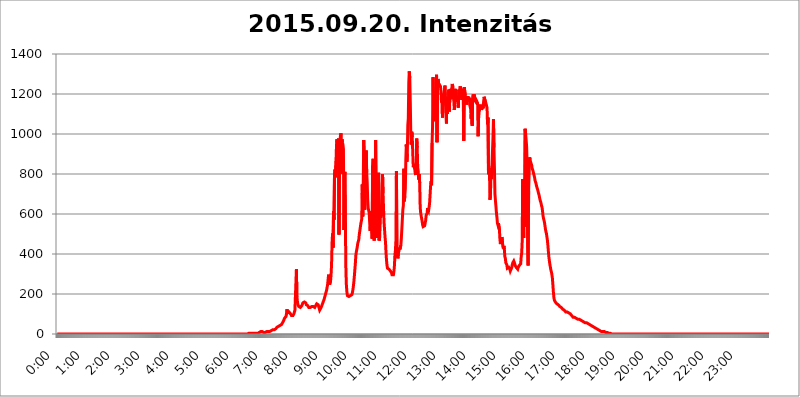
| Category | 2015.09.20. Intenzitás [W/m^2] |
|---|---|
| 0.0 | 0 |
| 0.0006944444444444445 | 0 |
| 0.001388888888888889 | 0 |
| 0.0020833333333333333 | 0 |
| 0.002777777777777778 | 0 |
| 0.003472222222222222 | 0 |
| 0.004166666666666667 | 0 |
| 0.004861111111111111 | 0 |
| 0.005555555555555556 | 0 |
| 0.0062499999999999995 | 0 |
| 0.006944444444444444 | 0 |
| 0.007638888888888889 | 0 |
| 0.008333333333333333 | 0 |
| 0.009027777777777779 | 0 |
| 0.009722222222222222 | 0 |
| 0.010416666666666666 | 0 |
| 0.011111111111111112 | 0 |
| 0.011805555555555555 | 0 |
| 0.012499999999999999 | 0 |
| 0.013194444444444444 | 0 |
| 0.013888888888888888 | 0 |
| 0.014583333333333332 | 0 |
| 0.015277777777777777 | 0 |
| 0.015972222222222224 | 0 |
| 0.016666666666666666 | 0 |
| 0.017361111111111112 | 0 |
| 0.018055555555555557 | 0 |
| 0.01875 | 0 |
| 0.019444444444444445 | 0 |
| 0.02013888888888889 | 0 |
| 0.020833333333333332 | 0 |
| 0.02152777777777778 | 0 |
| 0.022222222222222223 | 0 |
| 0.02291666666666667 | 0 |
| 0.02361111111111111 | 0 |
| 0.024305555555555556 | 0 |
| 0.024999999999999998 | 0 |
| 0.025694444444444447 | 0 |
| 0.02638888888888889 | 0 |
| 0.027083333333333334 | 0 |
| 0.027777777777777776 | 0 |
| 0.02847222222222222 | 0 |
| 0.029166666666666664 | 0 |
| 0.029861111111111113 | 0 |
| 0.030555555555555555 | 0 |
| 0.03125 | 0 |
| 0.03194444444444445 | 0 |
| 0.03263888888888889 | 0 |
| 0.03333333333333333 | 0 |
| 0.034027777777777775 | 0 |
| 0.034722222222222224 | 0 |
| 0.035416666666666666 | 0 |
| 0.036111111111111115 | 0 |
| 0.03680555555555556 | 0 |
| 0.0375 | 0 |
| 0.03819444444444444 | 0 |
| 0.03888888888888889 | 0 |
| 0.03958333333333333 | 0 |
| 0.04027777777777778 | 0 |
| 0.04097222222222222 | 0 |
| 0.041666666666666664 | 0 |
| 0.042361111111111106 | 0 |
| 0.04305555555555556 | 0 |
| 0.043750000000000004 | 0 |
| 0.044444444444444446 | 0 |
| 0.04513888888888889 | 0 |
| 0.04583333333333334 | 0 |
| 0.04652777777777778 | 0 |
| 0.04722222222222222 | 0 |
| 0.04791666666666666 | 0 |
| 0.04861111111111111 | 0 |
| 0.049305555555555554 | 0 |
| 0.049999999999999996 | 0 |
| 0.05069444444444445 | 0 |
| 0.051388888888888894 | 0 |
| 0.052083333333333336 | 0 |
| 0.05277777777777778 | 0 |
| 0.05347222222222222 | 0 |
| 0.05416666666666667 | 0 |
| 0.05486111111111111 | 0 |
| 0.05555555555555555 | 0 |
| 0.05625 | 0 |
| 0.05694444444444444 | 0 |
| 0.057638888888888885 | 0 |
| 0.05833333333333333 | 0 |
| 0.05902777777777778 | 0 |
| 0.059722222222222225 | 0 |
| 0.06041666666666667 | 0 |
| 0.061111111111111116 | 0 |
| 0.06180555555555556 | 0 |
| 0.0625 | 0 |
| 0.06319444444444444 | 0 |
| 0.06388888888888888 | 0 |
| 0.06458333333333334 | 0 |
| 0.06527777777777778 | 0 |
| 0.06597222222222222 | 0 |
| 0.06666666666666667 | 0 |
| 0.06736111111111111 | 0 |
| 0.06805555555555555 | 0 |
| 0.06874999999999999 | 0 |
| 0.06944444444444443 | 0 |
| 0.07013888888888889 | 0 |
| 0.07083333333333333 | 0 |
| 0.07152777777777779 | 0 |
| 0.07222222222222223 | 0 |
| 0.07291666666666667 | 0 |
| 0.07361111111111111 | 0 |
| 0.07430555555555556 | 0 |
| 0.075 | 0 |
| 0.07569444444444444 | 0 |
| 0.0763888888888889 | 0 |
| 0.07708333333333334 | 0 |
| 0.07777777777777778 | 0 |
| 0.07847222222222222 | 0 |
| 0.07916666666666666 | 0 |
| 0.0798611111111111 | 0 |
| 0.08055555555555556 | 0 |
| 0.08125 | 0 |
| 0.08194444444444444 | 0 |
| 0.08263888888888889 | 0 |
| 0.08333333333333333 | 0 |
| 0.08402777777777777 | 0 |
| 0.08472222222222221 | 0 |
| 0.08541666666666665 | 0 |
| 0.08611111111111112 | 0 |
| 0.08680555555555557 | 0 |
| 0.08750000000000001 | 0 |
| 0.08819444444444445 | 0 |
| 0.08888888888888889 | 0 |
| 0.08958333333333333 | 0 |
| 0.09027777777777778 | 0 |
| 0.09097222222222222 | 0 |
| 0.09166666666666667 | 0 |
| 0.09236111111111112 | 0 |
| 0.09305555555555556 | 0 |
| 0.09375 | 0 |
| 0.09444444444444444 | 0 |
| 0.09513888888888888 | 0 |
| 0.09583333333333333 | 0 |
| 0.09652777777777777 | 0 |
| 0.09722222222222222 | 0 |
| 0.09791666666666667 | 0 |
| 0.09861111111111111 | 0 |
| 0.09930555555555555 | 0 |
| 0.09999999999999999 | 0 |
| 0.10069444444444443 | 0 |
| 0.1013888888888889 | 0 |
| 0.10208333333333335 | 0 |
| 0.10277777777777779 | 0 |
| 0.10347222222222223 | 0 |
| 0.10416666666666667 | 0 |
| 0.10486111111111111 | 0 |
| 0.10555555555555556 | 0 |
| 0.10625 | 0 |
| 0.10694444444444444 | 0 |
| 0.1076388888888889 | 0 |
| 0.10833333333333334 | 0 |
| 0.10902777777777778 | 0 |
| 0.10972222222222222 | 0 |
| 0.1111111111111111 | 0 |
| 0.11180555555555556 | 0 |
| 0.11180555555555556 | 0 |
| 0.1125 | 0 |
| 0.11319444444444444 | 0 |
| 0.11388888888888889 | 0 |
| 0.11458333333333333 | 0 |
| 0.11527777777777777 | 0 |
| 0.11597222222222221 | 0 |
| 0.11666666666666665 | 0 |
| 0.1173611111111111 | 0 |
| 0.11805555555555557 | 0 |
| 0.11944444444444445 | 0 |
| 0.12013888888888889 | 0 |
| 0.12083333333333333 | 0 |
| 0.12152777777777778 | 0 |
| 0.12222222222222223 | 0 |
| 0.12291666666666667 | 0 |
| 0.12291666666666667 | 0 |
| 0.12361111111111112 | 0 |
| 0.12430555555555556 | 0 |
| 0.125 | 0 |
| 0.12569444444444444 | 0 |
| 0.12638888888888888 | 0 |
| 0.12708333333333333 | 0 |
| 0.16875 | 0 |
| 0.12847222222222224 | 0 |
| 0.12916666666666668 | 0 |
| 0.12986111111111112 | 0 |
| 0.13055555555555556 | 0 |
| 0.13125 | 0 |
| 0.13194444444444445 | 0 |
| 0.1326388888888889 | 0 |
| 0.13333333333333333 | 0 |
| 0.13402777777777777 | 0 |
| 0.13402777777777777 | 0 |
| 0.13472222222222222 | 0 |
| 0.13541666666666666 | 0 |
| 0.1361111111111111 | 0 |
| 0.13749999999999998 | 0 |
| 0.13819444444444443 | 0 |
| 0.1388888888888889 | 0 |
| 0.13958333333333334 | 0 |
| 0.14027777777777778 | 0 |
| 0.14097222222222222 | 0 |
| 0.14166666666666666 | 0 |
| 0.1423611111111111 | 0 |
| 0.14305555555555557 | 0 |
| 0.14375000000000002 | 0 |
| 0.14444444444444446 | 0 |
| 0.1451388888888889 | 0 |
| 0.1451388888888889 | 0 |
| 0.14652777777777778 | 0 |
| 0.14722222222222223 | 0 |
| 0.14791666666666667 | 0 |
| 0.1486111111111111 | 0 |
| 0.14930555555555555 | 0 |
| 0.15 | 0 |
| 0.15069444444444444 | 0 |
| 0.15138888888888888 | 0 |
| 0.15208333333333332 | 0 |
| 0.15277777777777776 | 0 |
| 0.15347222222222223 | 0 |
| 0.15416666666666667 | 0 |
| 0.15486111111111112 | 0 |
| 0.15555555555555556 | 0 |
| 0.15625 | 0 |
| 0.15694444444444444 | 0 |
| 0.15763888888888888 | 0 |
| 0.15833333333333333 | 0 |
| 0.15902777777777777 | 0 |
| 0.15972222222222224 | 0 |
| 0.16041666666666668 | 0 |
| 0.16111111111111112 | 0 |
| 0.16180555555555556 | 0 |
| 0.1625 | 0 |
| 0.16319444444444445 | 0 |
| 0.1638888888888889 | 0 |
| 0.16458333333333333 | 0 |
| 0.16527777777777777 | 0 |
| 0.16597222222222222 | 0 |
| 0.16666666666666666 | 0 |
| 0.1673611111111111 | 0 |
| 0.16805555555555554 | 0 |
| 0.16874999999999998 | 0 |
| 0.16944444444444443 | 0 |
| 0.17013888888888887 | 0 |
| 0.1708333333333333 | 0 |
| 0.17152777777777775 | 0 |
| 0.17222222222222225 | 0 |
| 0.1729166666666667 | 0 |
| 0.17361111111111113 | 0 |
| 0.17430555555555557 | 0 |
| 0.17500000000000002 | 0 |
| 0.17569444444444446 | 0 |
| 0.1763888888888889 | 0 |
| 0.17708333333333334 | 0 |
| 0.17777777777777778 | 0 |
| 0.17847222222222223 | 0 |
| 0.17916666666666667 | 0 |
| 0.1798611111111111 | 0 |
| 0.18055555555555555 | 0 |
| 0.18125 | 0 |
| 0.18194444444444444 | 0 |
| 0.1826388888888889 | 0 |
| 0.18333333333333335 | 0 |
| 0.1840277777777778 | 0 |
| 0.18472222222222223 | 0 |
| 0.18541666666666667 | 0 |
| 0.18611111111111112 | 0 |
| 0.18680555555555556 | 0 |
| 0.1875 | 0 |
| 0.18819444444444444 | 0 |
| 0.18888888888888888 | 0 |
| 0.18958333333333333 | 0 |
| 0.19027777777777777 | 0 |
| 0.1909722222222222 | 0 |
| 0.19166666666666665 | 0 |
| 0.19236111111111112 | 0 |
| 0.19305555555555554 | 0 |
| 0.19375 | 0 |
| 0.19444444444444445 | 0 |
| 0.1951388888888889 | 0 |
| 0.19583333333333333 | 0 |
| 0.19652777777777777 | 0 |
| 0.19722222222222222 | 0 |
| 0.19791666666666666 | 0 |
| 0.1986111111111111 | 0 |
| 0.19930555555555554 | 0 |
| 0.19999999999999998 | 0 |
| 0.20069444444444443 | 0 |
| 0.20138888888888887 | 0 |
| 0.2020833333333333 | 0 |
| 0.2027777777777778 | 0 |
| 0.2034722222222222 | 0 |
| 0.2041666666666667 | 0 |
| 0.20486111111111113 | 0 |
| 0.20555555555555557 | 0 |
| 0.20625000000000002 | 0 |
| 0.20694444444444446 | 0 |
| 0.2076388888888889 | 0 |
| 0.20833333333333334 | 0 |
| 0.20902777777777778 | 0 |
| 0.20972222222222223 | 0 |
| 0.21041666666666667 | 0 |
| 0.2111111111111111 | 0 |
| 0.21180555555555555 | 0 |
| 0.2125 | 0 |
| 0.21319444444444444 | 0 |
| 0.2138888888888889 | 0 |
| 0.21458333333333335 | 0 |
| 0.2152777777777778 | 0 |
| 0.21597222222222223 | 0 |
| 0.21666666666666667 | 0 |
| 0.21736111111111112 | 0 |
| 0.21805555555555556 | 0 |
| 0.21875 | 0 |
| 0.21944444444444444 | 0 |
| 0.22013888888888888 | 0 |
| 0.22083333333333333 | 0 |
| 0.22152777777777777 | 0 |
| 0.2222222222222222 | 0 |
| 0.22291666666666665 | 0 |
| 0.2236111111111111 | 0 |
| 0.22430555555555556 | 0 |
| 0.225 | 0 |
| 0.22569444444444445 | 0 |
| 0.2263888888888889 | 0 |
| 0.22708333333333333 | 0 |
| 0.22777777777777777 | 0 |
| 0.22847222222222222 | 0 |
| 0.22916666666666666 | 0 |
| 0.2298611111111111 | 0 |
| 0.23055555555555554 | 0 |
| 0.23124999999999998 | 0 |
| 0.23194444444444443 | 0 |
| 0.23263888888888887 | 0 |
| 0.2333333333333333 | 0 |
| 0.2340277777777778 | 0 |
| 0.2347222222222222 | 0 |
| 0.2354166666666667 | 0 |
| 0.23611111111111113 | 0 |
| 0.23680555555555557 | 0 |
| 0.23750000000000002 | 0 |
| 0.23819444444444446 | 0 |
| 0.2388888888888889 | 0 |
| 0.23958333333333334 | 0 |
| 0.24027777777777778 | 0 |
| 0.24097222222222223 | 0 |
| 0.24166666666666667 | 0 |
| 0.2423611111111111 | 0 |
| 0.24305555555555555 | 0 |
| 0.24375 | 0 |
| 0.24444444444444446 | 0 |
| 0.24513888888888888 | 0 |
| 0.24583333333333335 | 0 |
| 0.2465277777777778 | 0 |
| 0.24722222222222223 | 0 |
| 0.24791666666666667 | 0 |
| 0.24861111111111112 | 0 |
| 0.24930555555555556 | 0 |
| 0.25 | 0 |
| 0.25069444444444444 | 0 |
| 0.2513888888888889 | 0 |
| 0.2520833333333333 | 0 |
| 0.25277777777777777 | 0 |
| 0.2534722222222222 | 0 |
| 0.25416666666666665 | 0 |
| 0.2548611111111111 | 0 |
| 0.2555555555555556 | 0 |
| 0.25625000000000003 | 0 |
| 0.2569444444444445 | 0 |
| 0.2576388888888889 | 0 |
| 0.25833333333333336 | 0 |
| 0.2590277777777778 | 0 |
| 0.25972222222222224 | 0 |
| 0.2604166666666667 | 0 |
| 0.2611111111111111 | 0 |
| 0.26180555555555557 | 0 |
| 0.2625 | 0 |
| 0.26319444444444445 | 0 |
| 0.2638888888888889 | 0 |
| 0.26458333333333334 | 0 |
| 0.2652777777777778 | 0 |
| 0.2659722222222222 | 0 |
| 0.26666666666666666 | 0 |
| 0.2673611111111111 | 3.525 |
| 0.26805555555555555 | 3.525 |
| 0.26875 | 3.525 |
| 0.26944444444444443 | 3.525 |
| 0.2701388888888889 | 3.525 |
| 0.2708333333333333 | 3.525 |
| 0.27152777777777776 | 3.525 |
| 0.2722222222222222 | 3.525 |
| 0.27291666666666664 | 3.525 |
| 0.2736111111111111 | 3.525 |
| 0.2743055555555555 | 3.525 |
| 0.27499999999999997 | 3.525 |
| 0.27569444444444446 | 3.525 |
| 0.27638888888888885 | 3.525 |
| 0.27708333333333335 | 3.525 |
| 0.2777777777777778 | 3.525 |
| 0.27847222222222223 | 3.525 |
| 0.2791666666666667 | 3.525 |
| 0.2798611111111111 | 3.525 |
| 0.28055555555555556 | 3.525 |
| 0.28125 | 3.525 |
| 0.28194444444444444 | 3.525 |
| 0.2826388888888889 | 7.887 |
| 0.2833333333333333 | 7.887 |
| 0.28402777777777777 | 7.887 |
| 0.2847222222222222 | 7.887 |
| 0.28541666666666665 | 12.257 |
| 0.28611111111111115 | 12.257 |
| 0.28680555555555554 | 12.257 |
| 0.28750000000000003 | 12.257 |
| 0.2881944444444445 | 12.257 |
| 0.2888888888888889 | 12.257 |
| 0.28958333333333336 | 7.887 |
| 0.2902777777777778 | 7.887 |
| 0.29097222222222224 | 7.887 |
| 0.2916666666666667 | 7.887 |
| 0.2923611111111111 | 7.887 |
| 0.29305555555555557 | 12.257 |
| 0.29375 | 12.257 |
| 0.29444444444444445 | 12.257 |
| 0.2951388888888889 | 12.257 |
| 0.29583333333333334 | 12.257 |
| 0.2965277777777778 | 12.257 |
| 0.2972222222222222 | 12.257 |
| 0.29791666666666666 | 12.257 |
| 0.2986111111111111 | 16.636 |
| 0.29930555555555555 | 16.636 |
| 0.3 | 16.636 |
| 0.30069444444444443 | 16.636 |
| 0.3013888888888889 | 21.024 |
| 0.3020833333333333 | 21.024 |
| 0.30277777777777776 | 21.024 |
| 0.3034722222222222 | 21.024 |
| 0.30416666666666664 | 21.024 |
| 0.3048611111111111 | 25.419 |
| 0.3055555555555555 | 25.419 |
| 0.30624999999999997 | 25.419 |
| 0.3069444444444444 | 29.823 |
| 0.3076388888888889 | 29.823 |
| 0.30833333333333335 | 34.234 |
| 0.3090277777777778 | 34.234 |
| 0.30972222222222223 | 38.653 |
| 0.3104166666666667 | 38.653 |
| 0.3111111111111111 | 38.653 |
| 0.31180555555555556 | 38.653 |
| 0.3125 | 43.079 |
| 0.31319444444444444 | 43.079 |
| 0.3138888888888889 | 47.511 |
| 0.3145833333333333 | 47.511 |
| 0.31527777777777777 | 51.951 |
| 0.3159722222222222 | 56.398 |
| 0.31666666666666665 | 56.398 |
| 0.31736111111111115 | 65.31 |
| 0.31805555555555554 | 69.775 |
| 0.31875000000000003 | 78.722 |
| 0.3194444444444445 | 78.722 |
| 0.3201388888888889 | 83.205 |
| 0.32083333333333336 | 87.692 |
| 0.3215277777777778 | 101.184 |
| 0.32222222222222224 | 123.758 |
| 0.3229166666666667 | 105.69 |
| 0.3236111111111111 | 110.201 |
| 0.32430555555555557 | 110.201 |
| 0.325 | 110.201 |
| 0.32569444444444445 | 110.201 |
| 0.3263888888888889 | 110.201 |
| 0.32708333333333334 | 101.184 |
| 0.3277777777777778 | 96.682 |
| 0.3284722222222222 | 92.184 |
| 0.32916666666666666 | 92.184 |
| 0.3298611111111111 | 92.184 |
| 0.33055555555555555 | 92.184 |
| 0.33125 | 96.682 |
| 0.33194444444444443 | 101.184 |
| 0.3326388888888889 | 110.201 |
| 0.3333333333333333 | 119.235 |
| 0.3340277777777778 | 114.716 |
| 0.3347222222222222 | 123.758 |
| 0.3354166666666667 | 324.052 |
| 0.3361111111111111 | 187.378 |
| 0.3368055555555556 | 164.605 |
| 0.33749999999999997 | 146.423 |
| 0.33819444444444446 | 146.423 |
| 0.33888888888888885 | 137.347 |
| 0.33958333333333335 | 137.347 |
| 0.34027777777777773 | 132.814 |
| 0.34097222222222223 | 132.814 |
| 0.3416666666666666 | 132.814 |
| 0.3423611111111111 | 137.347 |
| 0.3430555555555555 | 141.884 |
| 0.34375 | 146.423 |
| 0.3444444444444445 | 155.509 |
| 0.3451388888888889 | 160.056 |
| 0.3458333333333334 | 160.056 |
| 0.34652777777777777 | 160.056 |
| 0.34722222222222227 | 160.056 |
| 0.34791666666666665 | 160.056 |
| 0.34861111111111115 | 155.509 |
| 0.34930555555555554 | 146.423 |
| 0.35000000000000003 | 141.884 |
| 0.3506944444444444 | 141.884 |
| 0.3513888888888889 | 141.884 |
| 0.3520833333333333 | 137.347 |
| 0.3527777777777778 | 132.814 |
| 0.3534722222222222 | 132.814 |
| 0.3541666666666667 | 132.814 |
| 0.3548611111111111 | 132.814 |
| 0.35555555555555557 | 132.814 |
| 0.35625 | 137.347 |
| 0.35694444444444445 | 137.347 |
| 0.3576388888888889 | 137.347 |
| 0.35833333333333334 | 137.347 |
| 0.3590277777777778 | 137.347 |
| 0.3597222222222222 | 132.814 |
| 0.36041666666666666 | 132.814 |
| 0.3611111111111111 | 132.814 |
| 0.36180555555555555 | 137.347 |
| 0.3625 | 141.884 |
| 0.36319444444444443 | 146.423 |
| 0.3638888888888889 | 150.964 |
| 0.3645833333333333 | 150.964 |
| 0.3652777777777778 | 150.964 |
| 0.3659722222222222 | 146.423 |
| 0.3666666666666667 | 137.347 |
| 0.3673611111111111 | 128.284 |
| 0.3680555555555556 | 119.235 |
| 0.36874999999999997 | 119.235 |
| 0.36944444444444446 | 123.758 |
| 0.37013888888888885 | 132.814 |
| 0.37083333333333335 | 137.347 |
| 0.37152777777777773 | 146.423 |
| 0.37222222222222223 | 150.964 |
| 0.3729166666666666 | 160.056 |
| 0.3736111111111111 | 164.605 |
| 0.3743055555555555 | 173.709 |
| 0.375 | 182.82 |
| 0.3756944444444445 | 191.937 |
| 0.3763888888888889 | 201.058 |
| 0.3770833333333334 | 210.182 |
| 0.37777777777777777 | 219.309 |
| 0.37847222222222227 | 233 |
| 0.37916666666666665 | 246.689 |
| 0.37986111111111115 | 251.251 |
| 0.38055555555555554 | 296.808 |
| 0.38125000000000003 | 274.047 |
| 0.3819444444444444 | 246.689 |
| 0.3826388888888889 | 251.251 |
| 0.3833333333333333 | 264.932 |
| 0.3840277777777778 | 296.808 |
| 0.3847222222222222 | 346.682 |
| 0.3854166666666667 | 453.968 |
| 0.3861111111111111 | 502.192 |
| 0.38680555555555557 | 431.833 |
| 0.3875 | 613.252 |
| 0.38819444444444445 | 571.049 |
| 0.3888888888888889 | 802.868 |
| 0.38958333333333334 | 822.26 |
| 0.3902777777777778 | 783.342 |
| 0.3909722222222222 | 864.493 |
| 0.39166666666666666 | 943.832 |
| 0.3923611111111111 | 973.772 |
| 0.39305555555555555 | 913.766 |
| 0.39375 | 958.814 |
| 0.39444444444444443 | 977.508 |
| 0.3951388888888889 | 497.836 |
| 0.3958333333333333 | 872.114 |
| 0.3965277777777778 | 966.295 |
| 0.3972222222222222 | 992.448 |
| 0.3979166666666667 | 1003.65 |
| 0.3986111111111111 | 802.868 |
| 0.3993055555555556 | 973.772 |
| 0.39999999999999997 | 958.814 |
| 0.40069444444444446 | 947.58 |
| 0.40138888888888885 | 925.06 |
| 0.40208333333333335 | 519.555 |
| 0.40277777777777773 | 787.258 |
| 0.40347222222222223 | 810.641 |
| 0.4041666666666666 | 532.513 |
| 0.4048611111111111 | 314.98 |
| 0.4055555555555555 | 242.127 |
| 0.40625 | 210.182 |
| 0.4069444444444445 | 191.937 |
| 0.4076388888888889 | 187.378 |
| 0.4083333333333334 | 187.378 |
| 0.40902777777777777 | 187.378 |
| 0.40972222222222227 | 187.378 |
| 0.41041666666666665 | 191.937 |
| 0.41111111111111115 | 191.937 |
| 0.41180555555555554 | 191.937 |
| 0.41250000000000003 | 191.937 |
| 0.4131944444444444 | 196.497 |
| 0.4138888888888889 | 205.62 |
| 0.4145833333333333 | 219.309 |
| 0.4152777777777778 | 237.564 |
| 0.4159722222222222 | 260.373 |
| 0.4166666666666667 | 287.709 |
| 0.4173611111111111 | 319.517 |
| 0.41805555555555557 | 351.198 |
| 0.41875 | 391.685 |
| 0.41944444444444445 | 409.574 |
| 0.4201388888888889 | 422.943 |
| 0.42083333333333334 | 436.27 |
| 0.4215277777777778 | 453.968 |
| 0.4222222222222222 | 453.968 |
| 0.42291666666666666 | 471.582 |
| 0.4236111111111111 | 497.836 |
| 0.42430555555555555 | 493.475 |
| 0.425 | 497.836 |
| 0.42569444444444443 | 549.704 |
| 0.4263888888888889 | 549.704 |
| 0.4270833333333333 | 575.299 |
| 0.4277777777777778 | 747.834 |
| 0.4284722222222222 | 588.009 |
| 0.4291666666666667 | 751.803 |
| 0.4298611111111111 | 970.034 |
| 0.4305555555555556 | 868.305 |
| 0.43124999999999997 | 621.613 |
| 0.43194444444444446 | 691.608 |
| 0.43263888888888885 | 841.526 |
| 0.43333333333333335 | 917.534 |
| 0.43402777777777773 | 806.757 |
| 0.43472222222222223 | 759.723 |
| 0.4354166666666666 | 671.22 |
| 0.4361111111111111 | 629.948 |
| 0.4368055555555555 | 634.105 |
| 0.4375 | 604.864 |
| 0.4381944444444445 | 558.261 |
| 0.4388888888888889 | 515.223 |
| 0.4395833333333334 | 571.049 |
| 0.44027777777777777 | 613.252 |
| 0.44097222222222227 | 523.88 |
| 0.44166666666666665 | 475.972 |
| 0.44236111111111115 | 841.526 |
| 0.44305555555555554 | 875.918 |
| 0.44375000000000003 | 515.223 |
| 0.4444444444444444 | 467.187 |
| 0.4451388888888889 | 489.108 |
| 0.4458333333333333 | 536.82 |
| 0.4465277777777778 | 970.034 |
| 0.4472222222222222 | 691.608 |
| 0.4479166666666667 | 583.779 |
| 0.4486111111111111 | 515.223 |
| 0.44930555555555557 | 480.356 |
| 0.45 | 562.53 |
| 0.45069444444444445 | 806.757 |
| 0.4513888888888889 | 467.187 |
| 0.45208333333333334 | 475.972 |
| 0.4527777777777778 | 541.121 |
| 0.4534722222222222 | 604.864 |
| 0.45416666666666666 | 588.009 |
| 0.4548611111111111 | 646.537 |
| 0.45555555555555555 | 739.877 |
| 0.45625 | 798.974 |
| 0.45694444444444443 | 703.762 |
| 0.4576388888888889 | 625.784 |
| 0.4583333333333333 | 558.261 |
| 0.4590277777777778 | 523.88 |
| 0.4597222222222222 | 484.735 |
| 0.4604166666666667 | 458.38 |
| 0.4611111111111111 | 405.108 |
| 0.4618055555555556 | 369.23 |
| 0.46249999999999997 | 342.162 |
| 0.46319444444444446 | 328.584 |
| 0.46388888888888885 | 324.052 |
| 0.46458333333333335 | 324.052 |
| 0.46527777777777773 | 324.052 |
| 0.46597222222222223 | 319.517 |
| 0.4666666666666666 | 319.517 |
| 0.4673611111111111 | 314.98 |
| 0.4680555555555555 | 310.44 |
| 0.46875 | 305.898 |
| 0.4694444444444445 | 296.808 |
| 0.4701388888888889 | 296.808 |
| 0.4708333333333334 | 296.808 |
| 0.47152777777777777 | 296.808 |
| 0.47222222222222227 | 314.98 |
| 0.47291666666666665 | 342.162 |
| 0.47361111111111115 | 396.164 |
| 0.47430555555555554 | 418.492 |
| 0.47500000000000003 | 467.187 |
| 0.4756944444444444 | 814.519 |
| 0.4763888888888889 | 427.39 |
| 0.4770833333333333 | 387.202 |
| 0.4777777777777778 | 378.224 |
| 0.4784722222222222 | 405.108 |
| 0.4791666666666667 | 414.035 |
| 0.4798611111111111 | 431.833 |
| 0.48055555555555557 | 422.943 |
| 0.48125 | 422.943 |
| 0.48194444444444445 | 445.129 |
| 0.4826388888888889 | 480.356 |
| 0.48333333333333334 | 528.2 |
| 0.4840277777777778 | 575.299 |
| 0.4847222222222222 | 621.613 |
| 0.48541666666666666 | 642.4 |
| 0.4861111111111111 | 826.123 |
| 0.48680555555555555 | 663.019 |
| 0.4875 | 691.608 |
| 0.48819444444444443 | 727.896 |
| 0.4888888888888889 | 872.114 |
| 0.4895833333333333 | 947.58 |
| 0.4902777777777778 | 860.676 |
| 0.4909722222222222 | 902.447 |
| 0.4916666666666667 | 1044.762 |
| 0.4923611111111111 | 1078.555 |
| 0.4930555555555556 | 1258.511 |
| 0.49374999999999997 | 1313.406 |
| 0.49444444444444446 | 1279.334 |
| 0.49513888888888885 | 1162.571 |
| 0.49583333333333335 | 1007.383 |
| 0.49652777777777773 | 947.58 |
| 0.49722222222222223 | 1011.118 |
| 0.4979166666666666 | 984.98 |
| 0.4986111111111111 | 906.223 |
| 0.4993055555555555 | 833.834 |
| 0.5 | 841.526 |
| 0.5006944444444444 | 845.365 |
| 0.5013888888888889 | 826.123 |
| 0.5020833333333333 | 802.868 |
| 0.5027777777777778 | 795.074 |
| 0.5034722222222222 | 829.981 |
| 0.5041666666666667 | 977.508 |
| 0.5048611111111111 | 932.576 |
| 0.5055555555555555 | 833.834 |
| 0.50625 | 814.519 |
| 0.5069444444444444 | 771.559 |
| 0.5076388888888889 | 798.974 |
| 0.5083333333333333 | 755.766 |
| 0.5090277777777777 | 634.105 |
| 0.5097222222222222 | 604.864 |
| 0.5104166666666666 | 600.661 |
| 0.5111111111111112 | 600.661 |
| 0.5118055555555555 | 562.53 |
| 0.5125000000000001 | 545.416 |
| 0.5131944444444444 | 536.82 |
| 0.513888888888889 | 536.82 |
| 0.5145833333333333 | 532.513 |
| 0.5152777777777778 | 541.121 |
| 0.5159722222222222 | 553.986 |
| 0.5166666666666667 | 566.793 |
| 0.517361111111111 | 592.233 |
| 0.5180555555555556 | 592.233 |
| 0.5187499999999999 | 604.864 |
| 0.5194444444444445 | 629.948 |
| 0.5201388888888888 | 629.948 |
| 0.5208333333333334 | 617.436 |
| 0.5215277777777778 | 634.105 |
| 0.5222222222222223 | 654.791 |
| 0.5229166666666667 | 695.666 |
| 0.5236111111111111 | 739.877 |
| 0.5243055555555556 | 763.674 |
| 0.525 | 743.859 |
| 0.5256944444444445 | 955.071 |
| 0.5263888888888889 | 1037.277 |
| 0.5270833333333333 | 1283.541 |
| 0.5277777777777778 | 1074.789 |
| 0.5284722222222222 | 1063.51 |
| 0.5291666666666667 | 1093.653 |
| 0.5298611111111111 | 1154.814 |
| 0.5305555555555556 | 1189.969 |
| 0.53125 | 1250.275 |
| 0.5319444444444444 | 1296.248 |
| 0.5326388888888889 | 958.814 |
| 0.5333333333333333 | 1197.876 |
| 0.5340277777777778 | 1275.142 |
| 0.5347222222222222 | 1258.511 |
| 0.5354166666666667 | 1238.014 |
| 0.5361111111111111 | 1246.176 |
| 0.5368055555555555 | 1242.089 |
| 0.5375 | 1238.014 |
| 0.5381944444444444 | 1213.804 |
| 0.5388888888888889 | 1158.689 |
| 0.5395833333333333 | 1189.969 |
| 0.5402777777777777 | 1082.324 |
| 0.5409722222222222 | 1150.946 |
| 0.5416666666666666 | 1197.876 |
| 0.5423611111111112 | 1197.876 |
| 0.5430555555555555 | 1217.812 |
| 0.5437500000000001 | 1242.089 |
| 0.5444444444444444 | 1162.571 |
| 0.545138888888889 | 1101.226 |
| 0.5458333333333333 | 1052.255 |
| 0.5465277777777778 | 1186.03 |
| 0.5472222222222222 | 1101.226 |
| 0.5479166666666667 | 1158.689 |
| 0.548611111111111 | 1150.946 |
| 0.5493055555555556 | 1221.83 |
| 0.5499999999999999 | 1112.618 |
| 0.5506944444444445 | 1209.807 |
| 0.5513888888888888 | 1225.859 |
| 0.5520833333333334 | 1209.807 |
| 0.5527777777777778 | 1174.263 |
| 0.5534722222222223 | 1178.177 |
| 0.5541666666666667 | 1250.275 |
| 0.5548611111111111 | 1233.951 |
| 0.5555555555555556 | 1213.804 |
| 0.55625 | 1209.807 |
| 0.5569444444444445 | 1120.238 |
| 0.5576388888888889 | 1209.807 |
| 0.5583333333333333 | 1225.859 |
| 0.5590277777777778 | 1197.876 |
| 0.5597222222222222 | 1193.918 |
| 0.5604166666666667 | 1186.03 |
| 0.5611111111111111 | 1174.263 |
| 0.5618055555555556 | 1174.263 |
| 0.5625 | 1131.708 |
| 0.5631944444444444 | 1221.83 |
| 0.5638888888888889 | 1217.812 |
| 0.5645833333333333 | 1209.807 |
| 0.5652777777777778 | 1238.014 |
| 0.5659722222222222 | 1209.807 |
| 0.5666666666666667 | 1201.843 |
| 0.5673611111111111 | 1170.358 |
| 0.5680555555555555 | 1209.807 |
| 0.56875 | 1189.969 |
| 0.5694444444444444 | 1225.859 |
| 0.5701388888888889 | 966.295 |
| 0.5708333333333333 | 1233.951 |
| 0.5715277777777777 | 1238.014 |
| 0.5722222222222222 | 1193.918 |
| 0.5729166666666666 | 1170.358 |
| 0.5736111111111112 | 1186.03 |
| 0.5743055555555555 | 1147.086 |
| 0.5750000000000001 | 1182.099 |
| 0.5756944444444444 | 1189.969 |
| 0.576388888888889 | 1162.571 |
| 0.5770833333333333 | 1186.03 |
| 0.5777777777777778 | 1162.571 |
| 0.5784722222222222 | 1178.177 |
| 0.5791666666666667 | 1135.543 |
| 0.579861111111111 | 1124.056 |
| 0.5805555555555556 | 1074.789 |
| 0.5812499999999999 | 1135.543 |
| 0.5819444444444445 | 1041.019 |
| 0.5826388888888888 | 1182.099 |
| 0.5833333333333334 | 1197.876 |
| 0.5840277777777778 | 1186.03 |
| 0.5847222222222223 | 1197.876 |
| 0.5854166666666667 | 1170.358 |
| 0.5861111111111111 | 1166.46 |
| 0.5868055555555556 | 1162.571 |
| 0.5875 | 1170.358 |
| 0.5881944444444445 | 1170.358 |
| 0.5888888888888889 | 1166.46 |
| 0.5895833333333333 | 1154.814 |
| 0.5902777777777778 | 988.714 |
| 0.5909722222222222 | 1078.555 |
| 0.5916666666666667 | 1112.618 |
| 0.5923611111111111 | 1147.086 |
| 0.5930555555555556 | 1124.056 |
| 0.59375 | 1127.879 |
| 0.5944444444444444 | 1131.708 |
| 0.5951388888888889 | 1120.238 |
| 0.5958333333333333 | 1131.708 |
| 0.5965277777777778 | 1139.384 |
| 0.5972222222222222 | 1127.879 |
| 0.5979166666666667 | 1147.086 |
| 0.5986111111111111 | 1186.03 |
| 0.5993055555555555 | 1178.177 |
| 0.6 | 1162.571 |
| 0.6006944444444444 | 1143.232 |
| 0.6013888888888889 | 1150.946 |
| 0.6020833333333333 | 1154.814 |
| 0.6027777777777777 | 1131.708 |
| 0.6034722222222222 | 1048.508 |
| 0.6041666666666666 | 1082.324 |
| 0.6048611111111112 | 798.974 |
| 0.6055555555555555 | 829.981 |
| 0.6062500000000001 | 798.974 |
| 0.6069444444444444 | 671.22 |
| 0.607638888888889 | 707.8 |
| 0.6083333333333333 | 787.258 |
| 0.6090277777777778 | 775.492 |
| 0.6097222222222222 | 841.526 |
| 0.6104166666666667 | 841.526 |
| 0.611111111111111 | 981.244 |
| 0.6118055555555556 | 1074.789 |
| 0.6124999999999999 | 932.576 |
| 0.6131944444444445 | 826.123 |
| 0.6138888888888888 | 699.717 |
| 0.6145833333333334 | 667.123 |
| 0.6152777777777778 | 638.256 |
| 0.6159722222222223 | 604.864 |
| 0.6166666666666667 | 583.779 |
| 0.6173611111111111 | 553.986 |
| 0.6180555555555556 | 545.416 |
| 0.61875 | 553.986 |
| 0.6194444444444445 | 558.261 |
| 0.6201388888888889 | 523.88 |
| 0.6208333333333333 | 475.972 |
| 0.6215277777777778 | 449.551 |
| 0.6222222222222222 | 449.551 |
| 0.6229166666666667 | 462.786 |
| 0.6236111111111111 | 484.735 |
| 0.6243055555555556 | 467.187 |
| 0.625 | 436.27 |
| 0.6256944444444444 | 427.39 |
| 0.6263888888888889 | 440.702 |
| 0.6270833333333333 | 422.943 |
| 0.6277777777777778 | 387.202 |
| 0.6284722222222222 | 378.224 |
| 0.6291666666666667 | 355.712 |
| 0.6298611111111111 | 360.221 |
| 0.6305555555555555 | 346.682 |
| 0.63125 | 328.584 |
| 0.6319444444444444 | 324.052 |
| 0.6326388888888889 | 328.584 |
| 0.6333333333333333 | 333.113 |
| 0.6340277777777777 | 328.584 |
| 0.6347222222222222 | 324.052 |
| 0.6354166666666666 | 314.98 |
| 0.6361111111111112 | 310.44 |
| 0.6368055555555555 | 314.98 |
| 0.6375000000000001 | 333.113 |
| 0.6381944444444444 | 346.682 |
| 0.638888888888889 | 355.712 |
| 0.6395833333333333 | 360.221 |
| 0.6402777777777778 | 364.728 |
| 0.6409722222222222 | 360.221 |
| 0.6416666666666667 | 351.198 |
| 0.642361111111111 | 342.162 |
| 0.6430555555555556 | 337.639 |
| 0.6437499999999999 | 333.113 |
| 0.6444444444444445 | 328.584 |
| 0.6451388888888888 | 328.584 |
| 0.6458333333333334 | 324.052 |
| 0.6465277777777778 | 333.113 |
| 0.6472222222222223 | 337.639 |
| 0.6479166666666667 | 342.162 |
| 0.6486111111111111 | 342.162 |
| 0.6493055555555556 | 342.162 |
| 0.65 | 351.198 |
| 0.6506944444444445 | 387.202 |
| 0.6513888888888889 | 405.108 |
| 0.6520833333333333 | 462.786 |
| 0.6527777777777778 | 775.492 |
| 0.6534722222222222 | 609.062 |
| 0.6541666666666667 | 480.356 |
| 0.6548611111111111 | 621.613 |
| 0.6555555555555556 | 536.82 |
| 0.65625 | 1026.06 |
| 0.6569444444444444 | 999.916 |
| 0.6576388888888889 | 970.034 |
| 0.6583333333333333 | 936.33 |
| 0.6590277777777778 | 845.365 |
| 0.6597222222222222 | 431.833 |
| 0.6604166666666667 | 342.162 |
| 0.6611111111111111 | 715.858 |
| 0.6618055555555555 | 711.832 |
| 0.6625 | 883.516 |
| 0.6631944444444444 | 872.114 |
| 0.6638888888888889 | 860.676 |
| 0.6645833333333333 | 853.029 |
| 0.6652777777777777 | 845.365 |
| 0.6659722222222222 | 829.981 |
| 0.6666666666666666 | 826.123 |
| 0.6673611111111111 | 814.519 |
| 0.6680555555555556 | 802.868 |
| 0.6687500000000001 | 798.974 |
| 0.6694444444444444 | 783.342 |
| 0.6701388888888888 | 767.62 |
| 0.6708333333333334 | 759.723 |
| 0.6715277777777778 | 751.803 |
| 0.6722222222222222 | 739.877 |
| 0.6729166666666666 | 731.896 |
| 0.6736111111111112 | 723.889 |
| 0.6743055555555556 | 719.877 |
| 0.6749999999999999 | 703.762 |
| 0.6756944444444444 | 695.666 |
| 0.6763888888888889 | 683.473 |
| 0.6770833333333334 | 671.22 |
| 0.6777777777777777 | 667.123 |
| 0.6784722222222223 | 654.791 |
| 0.6791666666666667 | 642.4 |
| 0.6798611111111111 | 634.105 |
| 0.6805555555555555 | 617.436 |
| 0.68125 | 592.233 |
| 0.6819444444444445 | 579.542 |
| 0.6826388888888889 | 575.299 |
| 0.6833333333333332 | 558.261 |
| 0.6840277777777778 | 541.121 |
| 0.6847222222222222 | 523.88 |
| 0.6854166666666667 | 510.885 |
| 0.686111111111111 | 502.192 |
| 0.6868055555555556 | 484.735 |
| 0.6875 | 467.187 |
| 0.6881944444444444 | 440.702 |
| 0.688888888888889 | 409.574 |
| 0.6895833333333333 | 382.715 |
| 0.6902777777777778 | 364.728 |
| 0.6909722222222222 | 346.682 |
| 0.6916666666666668 | 333.113 |
| 0.6923611111111111 | 319.517 |
| 0.6930555555555555 | 310.44 |
| 0.69375 | 296.808 |
| 0.6944444444444445 | 278.603 |
| 0.6951388888888889 | 246.689 |
| 0.6958333333333333 | 210.182 |
| 0.6965277777777777 | 182.82 |
| 0.6972222222222223 | 169.156 |
| 0.6979166666666666 | 164.605 |
| 0.6986111111111111 | 160.056 |
| 0.6993055555555556 | 155.509 |
| 0.7000000000000001 | 155.509 |
| 0.7006944444444444 | 150.964 |
| 0.7013888888888888 | 146.423 |
| 0.7020833333333334 | 146.423 |
| 0.7027777777777778 | 146.423 |
| 0.7034722222222222 | 141.884 |
| 0.7041666666666666 | 141.884 |
| 0.7048611111111112 | 137.347 |
| 0.7055555555555556 | 137.347 |
| 0.7062499999999999 | 132.814 |
| 0.7069444444444444 | 132.814 |
| 0.7076388888888889 | 128.284 |
| 0.7083333333333334 | 128.284 |
| 0.7090277777777777 | 123.758 |
| 0.7097222222222223 | 119.235 |
| 0.7104166666666667 | 119.235 |
| 0.7111111111111111 | 119.235 |
| 0.7118055555555555 | 114.716 |
| 0.7125 | 114.716 |
| 0.7131944444444445 | 110.201 |
| 0.7138888888888889 | 110.201 |
| 0.7145833333333332 | 110.201 |
| 0.7152777777777778 | 110.201 |
| 0.7159722222222222 | 105.69 |
| 0.7166666666666667 | 105.69 |
| 0.717361111111111 | 105.69 |
| 0.7180555555555556 | 105.69 |
| 0.71875 | 101.184 |
| 0.7194444444444444 | 101.184 |
| 0.720138888888889 | 101.184 |
| 0.7208333333333333 | 96.682 |
| 0.7215277777777778 | 92.184 |
| 0.7222222222222222 | 87.692 |
| 0.7229166666666668 | 87.692 |
| 0.7236111111111111 | 83.205 |
| 0.7243055555555555 | 83.205 |
| 0.725 | 83.205 |
| 0.7256944444444445 | 83.205 |
| 0.7263888888888889 | 83.205 |
| 0.7270833333333333 | 78.722 |
| 0.7277777777777777 | 78.722 |
| 0.7284722222222223 | 78.722 |
| 0.7291666666666666 | 78.722 |
| 0.7298611111111111 | 74.246 |
| 0.7305555555555556 | 74.246 |
| 0.7312500000000001 | 74.246 |
| 0.7319444444444444 | 74.246 |
| 0.7326388888888888 | 74.246 |
| 0.7333333333333334 | 69.775 |
| 0.7340277777777778 | 69.775 |
| 0.7347222222222222 | 69.775 |
| 0.7354166666666666 | 65.31 |
| 0.7361111111111112 | 65.31 |
| 0.7368055555555556 | 65.31 |
| 0.7374999999999999 | 65.31 |
| 0.7381944444444444 | 60.85 |
| 0.7388888888888889 | 60.85 |
| 0.7395833333333334 | 60.85 |
| 0.7402777777777777 | 56.398 |
| 0.7409722222222223 | 56.398 |
| 0.7416666666666667 | 56.398 |
| 0.7423611111111111 | 56.398 |
| 0.7430555555555555 | 51.951 |
| 0.74375 | 51.951 |
| 0.7444444444444445 | 51.951 |
| 0.7451388888888889 | 51.951 |
| 0.7458333333333332 | 47.511 |
| 0.7465277777777778 | 47.511 |
| 0.7472222222222222 | 47.511 |
| 0.7479166666666667 | 47.511 |
| 0.748611111111111 | 43.079 |
| 0.7493055555555556 | 43.079 |
| 0.75 | 38.653 |
| 0.7506944444444444 | 38.653 |
| 0.751388888888889 | 38.653 |
| 0.7520833333333333 | 38.653 |
| 0.7527777777777778 | 34.234 |
| 0.7534722222222222 | 34.234 |
| 0.7541666666666668 | 29.823 |
| 0.7548611111111111 | 29.823 |
| 0.7555555555555555 | 29.823 |
| 0.75625 | 25.419 |
| 0.7569444444444445 | 25.419 |
| 0.7576388888888889 | 21.024 |
| 0.7583333333333333 | 21.024 |
| 0.7590277777777777 | 21.024 |
| 0.7597222222222223 | 21.024 |
| 0.7604166666666666 | 16.636 |
| 0.7611111111111111 | 16.636 |
| 0.7618055555555556 | 16.636 |
| 0.7625000000000001 | 16.636 |
| 0.7631944444444444 | 12.257 |
| 0.7638888888888888 | 12.257 |
| 0.7645833333333334 | 12.257 |
| 0.7652777777777778 | 12.257 |
| 0.7659722222222222 | 12.257 |
| 0.7666666666666666 | 12.257 |
| 0.7673611111111112 | 12.257 |
| 0.7680555555555556 | 12.257 |
| 0.7687499999999999 | 12.257 |
| 0.7694444444444444 | 7.887 |
| 0.7701388888888889 | 7.887 |
| 0.7708333333333334 | 7.887 |
| 0.7715277777777777 | 7.887 |
| 0.7722222222222223 | 7.887 |
| 0.7729166666666667 | 3.525 |
| 0.7736111111111111 | 3.525 |
| 0.7743055555555555 | 3.525 |
| 0.775 | 3.525 |
| 0.7756944444444445 | 3.525 |
| 0.7763888888888889 | 3.525 |
| 0.7770833333333332 | 3.525 |
| 0.7777777777777778 | 0 |
| 0.7784722222222222 | 0 |
| 0.7791666666666667 | 0 |
| 0.779861111111111 | 0 |
| 0.7805555555555556 | 0 |
| 0.78125 | 0 |
| 0.7819444444444444 | 0 |
| 0.782638888888889 | 0 |
| 0.7833333333333333 | 0 |
| 0.7840277777777778 | 0 |
| 0.7847222222222222 | 0 |
| 0.7854166666666668 | 0 |
| 0.7861111111111111 | 0 |
| 0.7868055555555555 | 0 |
| 0.7875 | 0 |
| 0.7881944444444445 | 0 |
| 0.7888888888888889 | 0 |
| 0.7895833333333333 | 0 |
| 0.7902777777777777 | 0 |
| 0.7909722222222223 | 0 |
| 0.7916666666666666 | 0 |
| 0.7923611111111111 | 0 |
| 0.7930555555555556 | 0 |
| 0.7937500000000001 | 0 |
| 0.7944444444444444 | 0 |
| 0.7951388888888888 | 0 |
| 0.7958333333333334 | 0 |
| 0.7965277777777778 | 0 |
| 0.7972222222222222 | 0 |
| 0.7979166666666666 | 0 |
| 0.7986111111111112 | 0 |
| 0.7993055555555556 | 0 |
| 0.7999999999999999 | 0 |
| 0.8006944444444444 | 0 |
| 0.8013888888888889 | 0 |
| 0.8020833333333334 | 0 |
| 0.8027777777777777 | 0 |
| 0.8034722222222223 | 0 |
| 0.8041666666666667 | 0 |
| 0.8048611111111111 | 0 |
| 0.8055555555555555 | 0 |
| 0.80625 | 0 |
| 0.8069444444444445 | 0 |
| 0.8076388888888889 | 0 |
| 0.8083333333333332 | 0 |
| 0.8090277777777778 | 0 |
| 0.8097222222222222 | 0 |
| 0.8104166666666667 | 0 |
| 0.811111111111111 | 0 |
| 0.8118055555555556 | 0 |
| 0.8125 | 0 |
| 0.8131944444444444 | 0 |
| 0.813888888888889 | 0 |
| 0.8145833333333333 | 0 |
| 0.8152777777777778 | 0 |
| 0.8159722222222222 | 0 |
| 0.8166666666666668 | 0 |
| 0.8173611111111111 | 0 |
| 0.8180555555555555 | 0 |
| 0.81875 | 0 |
| 0.8194444444444445 | 0 |
| 0.8201388888888889 | 0 |
| 0.8208333333333333 | 0 |
| 0.8215277777777777 | 0 |
| 0.8222222222222223 | 0 |
| 0.8229166666666666 | 0 |
| 0.8236111111111111 | 0 |
| 0.8243055555555556 | 0 |
| 0.8250000000000001 | 0 |
| 0.8256944444444444 | 0 |
| 0.8263888888888888 | 0 |
| 0.8270833333333334 | 0 |
| 0.8277777777777778 | 0 |
| 0.8284722222222222 | 0 |
| 0.8291666666666666 | 0 |
| 0.8298611111111112 | 0 |
| 0.8305555555555556 | 0 |
| 0.8312499999999999 | 0 |
| 0.8319444444444444 | 0 |
| 0.8326388888888889 | 0 |
| 0.8333333333333334 | 0 |
| 0.8340277777777777 | 0 |
| 0.8347222222222223 | 0 |
| 0.8354166666666667 | 0 |
| 0.8361111111111111 | 0 |
| 0.8368055555555555 | 0 |
| 0.8375 | 0 |
| 0.8381944444444445 | 0 |
| 0.8388888888888889 | 0 |
| 0.8395833333333332 | 0 |
| 0.8402777777777778 | 0 |
| 0.8409722222222222 | 0 |
| 0.8416666666666667 | 0 |
| 0.842361111111111 | 0 |
| 0.8430555555555556 | 0 |
| 0.84375 | 0 |
| 0.8444444444444444 | 0 |
| 0.845138888888889 | 0 |
| 0.8458333333333333 | 0 |
| 0.8465277777777778 | 0 |
| 0.8472222222222222 | 0 |
| 0.8479166666666668 | 0 |
| 0.8486111111111111 | 0 |
| 0.8493055555555555 | 0 |
| 0.85 | 0 |
| 0.8506944444444445 | 0 |
| 0.8513888888888889 | 0 |
| 0.8520833333333333 | 0 |
| 0.8527777777777777 | 0 |
| 0.8534722222222223 | 0 |
| 0.8541666666666666 | 0 |
| 0.8548611111111111 | 0 |
| 0.8555555555555556 | 0 |
| 0.8562500000000001 | 0 |
| 0.8569444444444444 | 0 |
| 0.8576388888888888 | 0 |
| 0.8583333333333334 | 0 |
| 0.8590277777777778 | 0 |
| 0.8597222222222222 | 0 |
| 0.8604166666666666 | 0 |
| 0.8611111111111112 | 0 |
| 0.8618055555555556 | 0 |
| 0.8624999999999999 | 0 |
| 0.8631944444444444 | 0 |
| 0.8638888888888889 | 0 |
| 0.8645833333333334 | 0 |
| 0.8652777777777777 | 0 |
| 0.8659722222222223 | 0 |
| 0.8666666666666667 | 0 |
| 0.8673611111111111 | 0 |
| 0.8680555555555555 | 0 |
| 0.86875 | 0 |
| 0.8694444444444445 | 0 |
| 0.8701388888888889 | 0 |
| 0.8708333333333332 | 0 |
| 0.8715277777777778 | 0 |
| 0.8722222222222222 | 0 |
| 0.8729166666666667 | 0 |
| 0.873611111111111 | 0 |
| 0.8743055555555556 | 0 |
| 0.875 | 0 |
| 0.8756944444444444 | 0 |
| 0.876388888888889 | 0 |
| 0.8770833333333333 | 0 |
| 0.8777777777777778 | 0 |
| 0.8784722222222222 | 0 |
| 0.8791666666666668 | 0 |
| 0.8798611111111111 | 0 |
| 0.8805555555555555 | 0 |
| 0.88125 | 0 |
| 0.8819444444444445 | 0 |
| 0.8826388888888889 | 0 |
| 0.8833333333333333 | 0 |
| 0.8840277777777777 | 0 |
| 0.8847222222222223 | 0 |
| 0.8854166666666666 | 0 |
| 0.8861111111111111 | 0 |
| 0.8868055555555556 | 0 |
| 0.8875000000000001 | 0 |
| 0.8881944444444444 | 0 |
| 0.8888888888888888 | 0 |
| 0.8895833333333334 | 0 |
| 0.8902777777777778 | 0 |
| 0.8909722222222222 | 0 |
| 0.8916666666666666 | 0 |
| 0.8923611111111112 | 0 |
| 0.8930555555555556 | 0 |
| 0.8937499999999999 | 0 |
| 0.8944444444444444 | 0 |
| 0.8951388888888889 | 0 |
| 0.8958333333333334 | 0 |
| 0.8965277777777777 | 0 |
| 0.8972222222222223 | 0 |
| 0.8979166666666667 | 0 |
| 0.8986111111111111 | 0 |
| 0.8993055555555555 | 0 |
| 0.9 | 0 |
| 0.9006944444444445 | 0 |
| 0.9013888888888889 | 0 |
| 0.9020833333333332 | 0 |
| 0.9027777777777778 | 0 |
| 0.9034722222222222 | 0 |
| 0.9041666666666667 | 0 |
| 0.904861111111111 | 0 |
| 0.9055555555555556 | 0 |
| 0.90625 | 0 |
| 0.9069444444444444 | 0 |
| 0.907638888888889 | 0 |
| 0.9083333333333333 | 0 |
| 0.9090277777777778 | 0 |
| 0.9097222222222222 | 0 |
| 0.9104166666666668 | 0 |
| 0.9111111111111111 | 0 |
| 0.9118055555555555 | 0 |
| 0.9125 | 0 |
| 0.9131944444444445 | 0 |
| 0.9138888888888889 | 0 |
| 0.9145833333333333 | 0 |
| 0.9152777777777777 | 0 |
| 0.9159722222222223 | 0 |
| 0.9166666666666666 | 0 |
| 0.9173611111111111 | 0 |
| 0.9180555555555556 | 0 |
| 0.9187500000000001 | 0 |
| 0.9194444444444444 | 0 |
| 0.9201388888888888 | 0 |
| 0.9208333333333334 | 0 |
| 0.9215277777777778 | 0 |
| 0.9222222222222222 | 0 |
| 0.9229166666666666 | 0 |
| 0.9236111111111112 | 0 |
| 0.9243055555555556 | 0 |
| 0.9249999999999999 | 0 |
| 0.9256944444444444 | 0 |
| 0.9263888888888889 | 0 |
| 0.9270833333333334 | 0 |
| 0.9277777777777777 | 0 |
| 0.9284722222222223 | 0 |
| 0.9291666666666667 | 0 |
| 0.9298611111111111 | 0 |
| 0.9305555555555555 | 0 |
| 0.93125 | 0 |
| 0.9319444444444445 | 0 |
| 0.9326388888888889 | 0 |
| 0.9333333333333332 | 0 |
| 0.9340277777777778 | 0 |
| 0.9347222222222222 | 0 |
| 0.9354166666666667 | 0 |
| 0.936111111111111 | 0 |
| 0.9368055555555556 | 0 |
| 0.9375 | 0 |
| 0.9381944444444444 | 0 |
| 0.938888888888889 | 0 |
| 0.9395833333333333 | 0 |
| 0.9402777777777778 | 0 |
| 0.9409722222222222 | 0 |
| 0.9416666666666668 | 0 |
| 0.9423611111111111 | 0 |
| 0.9430555555555555 | 0 |
| 0.94375 | 0 |
| 0.9444444444444445 | 0 |
| 0.9451388888888889 | 0 |
| 0.9458333333333333 | 0 |
| 0.9465277777777777 | 0 |
| 0.9472222222222223 | 0 |
| 0.9479166666666666 | 0 |
| 0.9486111111111111 | 0 |
| 0.9493055555555556 | 0 |
| 0.9500000000000001 | 0 |
| 0.9506944444444444 | 0 |
| 0.9513888888888888 | 0 |
| 0.9520833333333334 | 0 |
| 0.9527777777777778 | 0 |
| 0.9534722222222222 | 0 |
| 0.9541666666666666 | 0 |
| 0.9548611111111112 | 0 |
| 0.9555555555555556 | 0 |
| 0.9562499999999999 | 0 |
| 0.9569444444444444 | 0 |
| 0.9576388888888889 | 0 |
| 0.9583333333333334 | 0 |
| 0.9590277777777777 | 0 |
| 0.9597222222222223 | 0 |
| 0.9604166666666667 | 0 |
| 0.9611111111111111 | 0 |
| 0.9618055555555555 | 0 |
| 0.9625 | 0 |
| 0.9631944444444445 | 0 |
| 0.9638888888888889 | 0 |
| 0.9645833333333332 | 0 |
| 0.9652777777777778 | 0 |
| 0.9659722222222222 | 0 |
| 0.9666666666666667 | 0 |
| 0.967361111111111 | 0 |
| 0.9680555555555556 | 0 |
| 0.96875 | 0 |
| 0.9694444444444444 | 0 |
| 0.970138888888889 | 0 |
| 0.9708333333333333 | 0 |
| 0.9715277777777778 | 0 |
| 0.9722222222222222 | 0 |
| 0.9729166666666668 | 0 |
| 0.9736111111111111 | 0 |
| 0.9743055555555555 | 0 |
| 0.975 | 0 |
| 0.9756944444444445 | 0 |
| 0.9763888888888889 | 0 |
| 0.9770833333333333 | 0 |
| 0.9777777777777777 | 0 |
| 0.9784722222222223 | 0 |
| 0.9791666666666666 | 0 |
| 0.9798611111111111 | 0 |
| 0.9805555555555556 | 0 |
| 0.9812500000000001 | 0 |
| 0.9819444444444444 | 0 |
| 0.9826388888888888 | 0 |
| 0.9833333333333334 | 0 |
| 0.9840277777777778 | 0 |
| 0.9847222222222222 | 0 |
| 0.9854166666666666 | 0 |
| 0.9861111111111112 | 0 |
| 0.9868055555555556 | 0 |
| 0.9874999999999999 | 0 |
| 0.9881944444444444 | 0 |
| 0.9888888888888889 | 0 |
| 0.9895833333333334 | 0 |
| 0.9902777777777777 | 0 |
| 0.9909722222222223 | 0 |
| 0.9916666666666667 | 0 |
| 0.9923611111111111 | 0 |
| 0.9930555555555555 | 0 |
| 0.99375 | 0 |
| 0.9944444444444445 | 0 |
| 0.9951388888888889 | 0 |
| 0.9958333333333332 | 0 |
| 0.9965277777777778 | 0 |
| 0.9972222222222222 | 0 |
| 0.9979166666666667 | 0 |
| 0.998611111111111 | 0 |
| 0.9993055555555556 | 0 |